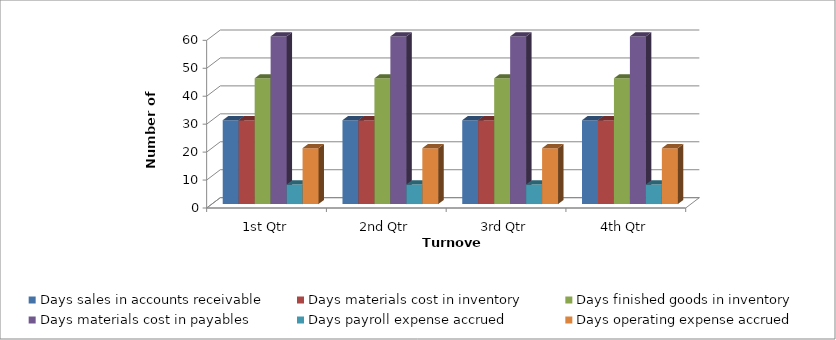
| Category | Days sales in accounts receivable | Days materials cost in inventory | Days finished goods in inventory | Days materials cost in payables | Days payroll expense accrued | Days operating expense accrued |
|---|---|---|---|---|---|---|
| 1st Qtr | 30 | 30 | 45 | 60 | 7 | 20 |
| 2nd Qtr | 30 | 30 | 45 | 60 | 7 | 20 |
| 3rd Qtr | 30 | 30 | 45 | 60 | 7 | 20 |
| 4th Qtr | 30 | 30 | 45 | 60 | 7 | 20 |